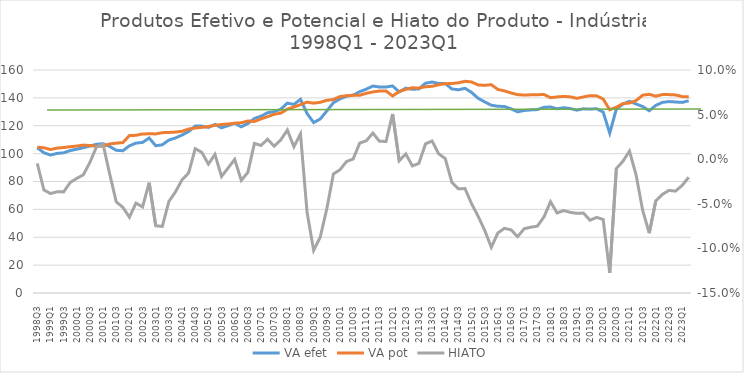
| Category | VA efet | VA pot |
|---|---|---|
| 1998Q3 | 104.171 | 104.667 |
| 1998Q4 | 100.637 | 104.225 |
| 1999Q1 | 98.978 | 102.939 |
| 1999Q2 | 100.157 | 103.961 |
| 1999Q3 | 100.576 | 104.402 |
| 1999Q4 | 102.216 | 104.955 |
| 2000Q1 | 103.155 | 105.419 |
| 2000Q2 | 104.262 | 106.12 |
| 2000Q3 | 105.427 | 105.796 |
| 2000Q4 | 106.739 | 105.272 |
| 2001Q1 | 107.079 | 105.327 |
| 2001Q2 | 105.162 | 106.927 |
| 2001Q3 | 102.388 | 107.528 |
| 2001Q4 | 102.093 | 107.916 |
| 2002Q1 | 105.586 | 112.929 |
| 2002Q2 | 107.566 | 113.136 |
| 2002Q3 | 108.023 | 114.128 |
| 2002Q4 | 111.189 | 114.199 |
| 2003Q1 | 105.642 | 114.156 |
| 2003Q2 | 106.359 | 115.028 |
| 2003Q3 | 109.745 | 115.198 |
| 2003Q4 | 111.235 | 115.463 |
| 2004Q1 | 113.329 | 116.007 |
| 2004Q2 | 115.856 | 117.673 |
| 2004Q3 | 119.773 | 118.376 |
| 2004Q4 | 119.754 | 118.842 |
| 2005Q1 | 118.797 | 119.451 |
| 2005Q2 | 120.929 | 120.283 |
| 2005Q3 | 118.538 | 120.879 |
| 2005Q4 | 120.09 | 121.284 |
| 2006Q1 | 121.791 | 121.814 |
| 2006Q2 | 119.231 | 122.127 |
| 2006Q3 | 121.576 | 123.404 |
| 2006Q4 | 125.213 | 123.041 |
| 2007Q1 | 126.865 | 124.94 |
| 2007Q2 | 129.319 | 126.486 |
| 2007Q3 | 130.122 | 128.253 |
| 2007Q4 | 131.822 | 129.034 |
| 2008Q1 | 136.227 | 131.913 |
| 2008Q2 | 135.316 | 133.454 |
| 2008Q3 | 138.967 | 135.144 |
| 2008Q4 | 128.774 | 136.944 |
| 2009Q1 | 122.283 | 136.199 |
| 2009Q2 | 124.859 | 136.826 |
| 2009Q3 | 130.58 | 138.259 |
| 2009Q4 | 136.506 | 138.807 |
| 2010Q1 | 139.276 | 140.942 |
| 2010Q2 | 141.149 | 141.511 |
| 2010Q3 | 141.955 | 141.925 |
| 2010Q4 | 144.44 | 141.875 |
| 2011Q1 | 146.242 | 143.282 |
| 2011Q2 | 148.509 | 144.276 |
| 2011Q3 | 147.783 | 144.868 |
| 2011Q4 | 147.798 | 144.916 |
| 2012Q1 | 148.551 | 141.381 |
| 2012Q2 | 144.288 | 144.549 |
| 2012Q3 | 146.964 | 146.096 |
| 2012Q4 | 146.116 | 147.226 |
| 2013Q1 | 146.389 | 147.078 |
| 2013Q2 | 150.515 | 147.965 |
| 2013Q3 | 151.353 | 148.321 |
| 2013Q4 | 150.321 | 149.425 |
| 2014Q1 | 150.296 | 150.184 |
| 2014Q2 | 146.409 | 150.289 |
| 2014Q3 | 145.806 | 150.821 |
| 2014Q4 | 146.884 | 151.884 |
| 2015Q1 | 143.892 | 151.453 |
| 2015Q2 | 139.709 | 149.265 |
| 2015Q3 | 137.105 | 149.005 |
| 2015Q4 | 134.726 | 149.489 |
| 2016Q1 | 133.968 | 146.035 |
| 2016Q2 | 133.805 | 145.045 |
| 2016Q3 | 132.136 | 143.497 |
| 2016Q4 | 129.983 | 142.341 |
| 2017Q1 | 130.943 | 142.007 |
| 2017Q2 | 131.366 | 142.205 |
| 2017Q3 | 131.59 | 142.27 |
| 2017Q4 | 133.229 | 142.443 |
| 2018Q1 | 133.468 | 140.154 |
| 2018Q2 | 132.182 | 140.665 |
| 2018Q3 | 132.928 | 141.048 |
| 2018Q4 | 132.333 | 140.717 |
| 2019Q1 | 131.199 | 139.676 |
| 2019Q2 | 132.146 | 140.635 |
| 2019Q3 | 131.921 | 141.611 |
| 2019Q4 | 132.242 | 141.474 |
| 2020Q1 | 129.789 | 139.191 |
| 2020Q2 | 114.701 | 131.461 |
| 2020Q3 | 131.932 | 133.331 |
| 2020Q4 | 135.534 | 135.865 |
| 2021Q1 | 137.543 | 136.299 |
| 2021Q2 | 135.607 | 138.027 |
| 2021Q3 | 133.798 | 141.92 |
| 2021Q4 | 130.754 | 142.574 |
| 2022Q1 | 134.621 | 141.207 |
| 2022Q2 | 136.756 | 142.372 |
| 2022Q3 | 137.353 | 142.332 |
| 2022Q4 | 137.035 | 142.119 |
| 2023Q1 | 136.755 | 140.897 |
| 2023Q2 | 137.938 | 140.79 |